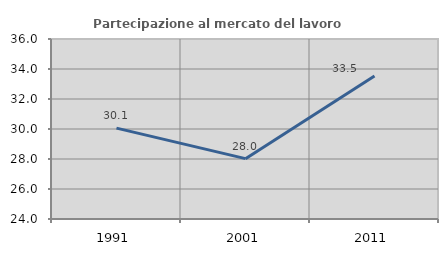
| Category | Partecipazione al mercato del lavoro  femminile |
|---|---|
| 1991.0 | 30.059 |
| 2001.0 | 28.023 |
| 2011.0 | 33.54 |